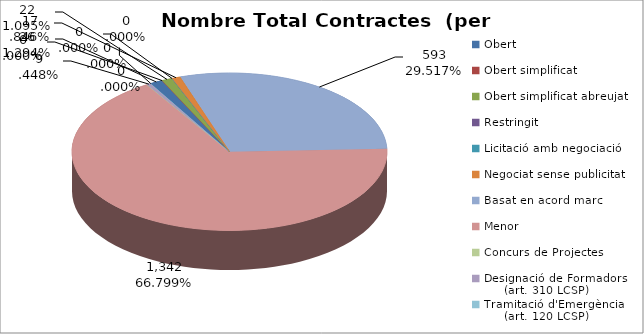
| Category | Nombre Total Contractes |
|---|---|
| Obert | 26 |
| Obert simplificat | 0 |
| Obert simplificat abreujat | 22 |
| Restringit | 0 |
| Licitació amb negociació | 0 |
| Negociat sense publicitat | 17 |
| Basat en acord marc | 593 |
| Menor | 1342 |
| Concurs de Projectes | 0 |
| Designació de Formadors
     (art. 310 LCSP) | 9 |
| Tramitació d'Emergència
     (art. 120 LCSP) | 0 |